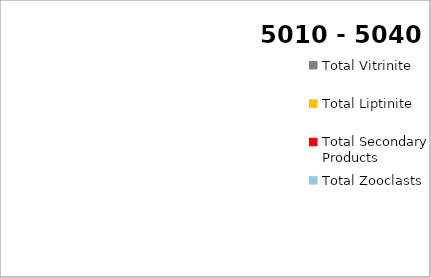
| Category | Series 5 |
|---|---|
| Total Vitrinite | 0 |
| Total Liptinite | 0 |
| Total  Inertinite | 0 |
| Total Secondary Products | 0 |
| Total Zooclasts | 0 |